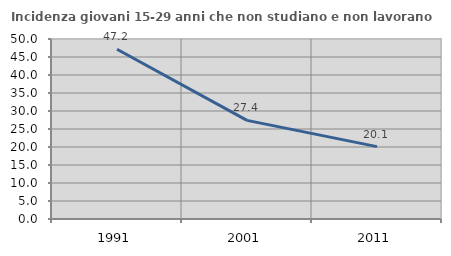
| Category | Incidenza giovani 15-29 anni che non studiano e non lavorano  |
|---|---|
| 1991.0 | 47.164 |
| 2001.0 | 27.394 |
| 2011.0 | 20.099 |